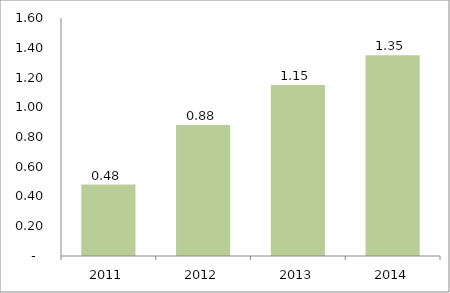
| Category | Dividends |
|---|---|
| 2011.0 | 0.48 |
| 2012.0 | 0.88 |
| 2013.0 | 1.15 |
| 2014.0 | 1.35 |